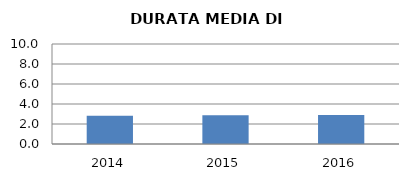
| Category | 2014 2015 2016 |
|---|---|
| 2014.0 | 2.815 |
| 2015.0 | 2.882 |
| 2016.0 | 2.889 |